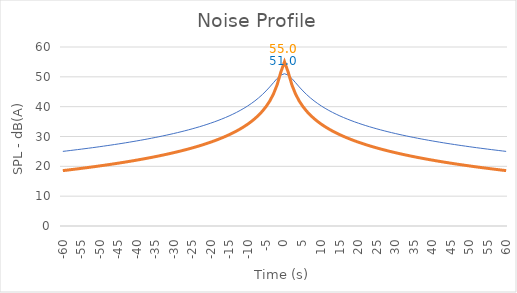
| Category | 30 km/h | 100 km/h |
|---|---|---|
| -60.0 | 25.01 | 18.562 |
| -59.0 | 25.155 | 18.708 |
| -58.0 | 25.303 | 18.856 |
| -57.0 | 25.454 | 19.007 |
| -56.0 | 25.607 | 19.161 |
| -55.0 | 25.763 | 19.318 |
| -54.0 | 25.922 | 19.477 |
| -53.0 | 26.084 | 19.639 |
| -52.0 | 26.249 | 19.805 |
| -51.0 | 26.417 | 19.973 |
| -50.0 | 26.589 | 20.145 |
| -49.0 | 26.763 | 20.321 |
| -48.0 | 26.942 | 20.5 |
| -47.0 | 27.124 | 20.683 |
| -46.0 | 27.31 | 20.869 |
| -45.0 | 27.5 | 21.06 |
| -44.0 | 27.694 | 21.255 |
| -43.0 | 27.893 | 21.455 |
| -42.0 | 28.097 | 21.659 |
| -41.0 | 28.305 | 21.868 |
| -40.0 | 28.518 | 22.083 |
| -39.0 | 28.737 | 22.302 |
| -38.0 | 28.961 | 22.528 |
| -37.0 | 29.191 | 22.759 |
| -36.0 | 29.428 | 22.997 |
| -35.0 | 29.67 | 23.242 |
| -34.0 | 29.92 | 23.493 |
| -33.0 | 30.178 | 23.753 |
| -32.0 | 30.443 | 24.02 |
| -31.0 | 30.716 | 24.295 |
| -30.0 | 30.998 | 24.58 |
| -29.0 | 31.289 | 24.874 |
| -28.0 | 31.591 | 25.178 |
| -27.0 | 31.903 | 25.494 |
| -26.0 | 32.227 | 25.821 |
| -25.0 | 32.563 | 26.162 |
| -24.0 | 32.912 | 26.516 |
| -23.0 | 33.276 | 26.885 |
| -22.0 | 33.655 | 27.27 |
| -21.0 | 34.051 | 27.674 |
| -20.0 | 34.466 | 28.097 |
| -19.0 | 34.902 | 28.541 |
| -18.0 | 35.359 | 29.01 |
| -17.0 | 35.841 | 29.505 |
| -16.0 | 36.351 | 30.03 |
| -15.0 | 36.891 | 30.589 |
| -14.0 | 37.466 | 31.186 |
| -13.0 | 38.079 | 31.826 |
| -12.0 | 38.737 | 32.518 |
| -11.0 | 39.444 | 33.269 |
| -10.0 | 40.209 | 34.091 |
| -9.0 | 41.041 | 34.998 |
| -8.0 | 41.95 | 36.01 |
| -7.0 | 42.949 | 37.153 |
| -6.0 | 44.051 | 38.466 |
| -5.0 | 45.269 | 40.008 |
| -4.0 | 46.604 | 41.87 |
| -3.0 | 48.031 | 44.209 |
| -2.0 | 49.444 | 47.305 |
| -1.0 | 50.584 | 51.549 |
| 0.0 | 51.041 | 55.041 |
| 1.0 | 50.584 | 51.549 |
| 2.0 | 49.444 | 47.305 |
| 3.0 | 48.031 | 44.209 |
| 4.0 | 46.604 | 41.87 |
| 5.0 | 45.269 | 40.008 |
| 6.0 | 44.051 | 38.466 |
| 7.0 | 42.949 | 37.153 |
| 8.0 | 41.95 | 36.01 |
| 9.0 | 41.041 | 34.998 |
| 10.0 | 40.209 | 34.091 |
| 11.0 | 39.444 | 33.269 |
| 12.0 | 38.737 | 32.518 |
| 13.0 | 38.079 | 31.826 |
| 14.0 | 37.466 | 31.186 |
| 15.0 | 36.891 | 30.589 |
| 16.0 | 36.351 | 30.03 |
| 17.0 | 35.841 | 29.505 |
| 18.0 | 35.359 | 29.01 |
| 19.0 | 34.902 | 28.541 |
| 20.0 | 34.466 | 28.097 |
| 21.0 | 34.051 | 27.674 |
| 22.0 | 33.655 | 27.27 |
| 23.0 | 33.276 | 26.885 |
| 24.0 | 32.912 | 26.516 |
| 25.0 | 32.563 | 26.162 |
| 26.0 | 32.227 | 25.821 |
| 27.0 | 31.903 | 25.494 |
| 28.0 | 31.591 | 25.178 |
| 29.0 | 31.289 | 24.874 |
| 30.0 | 30.998 | 24.58 |
| 31.0 | 30.716 | 24.295 |
| 32.0 | 30.443 | 24.02 |
| 33.0 | 30.178 | 23.753 |
| 34.0 | 29.92 | 23.493 |
| 35.0 | 29.67 | 23.242 |
| 36.0 | 29.428 | 22.997 |
| 37.0 | 29.191 | 22.759 |
| 38.0 | 28.961 | 22.528 |
| 39.0 | 28.737 | 22.302 |
| 40.0 | 28.518 | 22.083 |
| 41.0 | 28.305 | 21.868 |
| 42.0 | 28.097 | 21.659 |
| 43.0 | 27.893 | 21.455 |
| 44.0 | 27.694 | 21.255 |
| 45.0 | 27.5 | 21.06 |
| 46.0 | 27.31 | 20.869 |
| 47.0 | 27.124 | 20.683 |
| 48.0 | 26.942 | 20.5 |
| 49.0 | 26.763 | 20.321 |
| 50.0 | 26.589 | 20.145 |
| 51.0 | 26.417 | 19.973 |
| 52.0 | 26.249 | 19.805 |
| 53.0 | 26.084 | 19.639 |
| 54.0 | 25.922 | 19.477 |
| 55.0 | 25.763 | 19.318 |
| 56.0 | 25.607 | 19.161 |
| 57.0 | 25.454 | 19.007 |
| 58.0 | 25.303 | 18.856 |
| 59.0 | 25.155 | 18.708 |
| 60.0 | 25.01 | 18.562 |